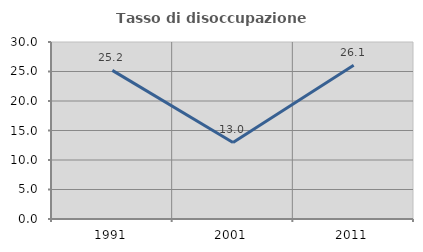
| Category | Tasso di disoccupazione giovanile  |
|---|---|
| 1991.0 | 25.185 |
| 2001.0 | 12.971 |
| 2011.0 | 26.064 |